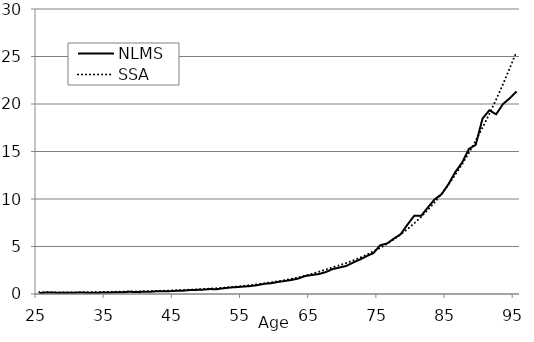
| Category | NLMS | SSA |
|---|---|---|
| 25.0 | 0.096 | 0.19 |
| 26.0 | 0.157 | 0.184 |
| 27.0 | 0.151 | 0.178 |
| 28.0 | 0.117 | 0.177 |
| 29.0 | 0.136 | 0.178 |
| 30.0 | 0.132 | 0.182 |
| 31.0 | 0.155 | 0.188 |
| 32.0 | 0.141 | 0.195 |
| 33.0 | 0.142 | 0.203 |
| 34.0 | 0.144 | 0.211 |
| 35.0 | 0.148 | 0.222 |
| 36.0 | 0.188 | 0.234 |
| 37.0 | 0.178 | 0.247 |
| 38.0 | 0.23 | 0.259 |
| 39.0 | 0.219 | 0.27 |
| 40.0 | 0.224 | 0.283 |
| 41.0 | 0.223 | 0.298 |
| 42.0 | 0.279 | 0.317 |
| 43.0 | 0.278 | 0.338 |
| 44.0 | 0.293 | 0.362 |
| 45.0 | 0.333 | 0.389 |
| 46.0 | 0.345 | 0.419 |
| 47.0 | 0.409 | 0.452 |
| 48.0 | 0.429 | 0.488 |
| 49.0 | 0.461 | 0.526 |
| 50.0 | 0.515 | 0.567 |
| 51.0 | 0.507 | 0.611 |
| 52.0 | 0.6 | 0.661 |
| 53.0 | 0.684 | 0.72 |
| 54.0 | 0.728 | 0.785 |
| 55.0 | 0.786 | 0.857 |
| 56.0 | 0.835 | 0.938 |
| 57.0 | 0.932 | 1.028 |
| 58.0 | 1.073 | 1.125 |
| 59.0 | 1.131 | 1.229 |
| 60.0 | 1.273 | 1.342 |
| 61.0 | 1.368 | 1.465 |
| 62.0 | 1.482 | 1.601 |
| 63.0 | 1.633 | 1.757 |
| 64.0 | 1.894 | 1.935 |
| 65.0 | 2.003 | 2.132 |
| 66.0 | 2.102 | 2.347 |
| 67.0 | 2.303 | 2.573 |
| 68.0 | 2.619 | 2.8 |
| 69.0 | 2.782 | 3.025 |
| 70.0 | 2.954 | 3.259 |
| 71.0 | 3.3 | 3.52 |
| 72.0 | 3.623 | 3.815 |
| 73.0 | 3.985 | 4.136 |
| 74.0 | 4.305 | 4.484 |
| 75.0 | 5.132 | 4.864 |
| 76.0 | 5.319 | 5.284 |
| 77.0 | 5.832 | 5.751 |
| 78.0 | 6.294 | 6.265 |
| 79.0 | 7.311 | 6.83 |
| 80.0 | 8.25 | 7.449 |
| 81.0 | 8.232 | 8.126 |
| 82.0 | 9.126 | 8.864 |
| 83.0 | 9.976 | 9.672 |
| 84.0 | 10.505 | 10.552 |
| 85.0 | 11.552 | 11.509 |
| 86.0 | 12.824 | 12.546 |
| 87.0 | 13.821 | 13.664 |
| 88.0 | 15.265 | 14.861 |
| 89.0 | 15.7 | 16.141 |
| 90.0 | 18.465 | 17.504 |
| 91.0 | 19.336 | 18.95 |
| 92.0 | 18.917 | 20.472 |
| 93.0 | 19.992 | 22.082 |
| 94.0 | 20.608 | 23.771 |
| 95.0 | 21.315 | 25.531 |